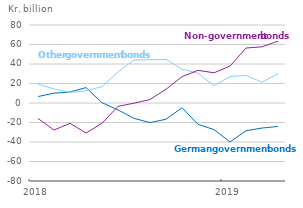
| Category | Accumulated purchase of German government bonds | Accumulated purchase of Other government bonds | Accumulatede purchase of non-government bonds |
|---|---|---|---|
| 2018.0 | 6.632 | 19.434 | -15.899 |
| 20180201.0 | 10.1 | 14.374 | -27.687 |
| 20180301.0 | 11.264 | 10.882 | -20.851 |
| 20180401.0 | 15.802 | 12.563 | -30.815 |
| 20180501.0 | 0.297 | 16.794 | -20.744 |
| 20180601.0 | -7.048 | 31.844 | -3.474 |
| 20180701.0 | -15.751 | 44.062 | -0.176 |
| 20180801.0 | -20.115 | 44.383 | 3.531 |
| 20180901.0 | -16.647 | 44.665 | 14.087 |
| 20181001.0 | -4.846 | 34.756 | 26.996 |
| 20181101.0 | -21.897 | 30.636 | 33.48 |
| 20181201.0 | -27.261 | 17.744 | 30.975 |
| 2019.0 | -39.962 | 27.161 | 37.816 |
| 20190201.0 | -28.477 | 28.233 | 56.392 |
| 20190301.0 | -25.675 | 21.387 | 57.623 |
| 20190401.0 | -24.035 | 30.033 | 63.526 |